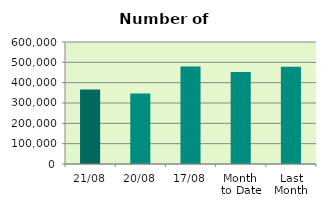
| Category | Series 0 |
|---|---|
| 21/08 | 366950 |
| 20/08 | 346882 |
| 17/08 | 479436 |
| Month 
to Date | 452257.467 |
| Last
Month | 477777.545 |